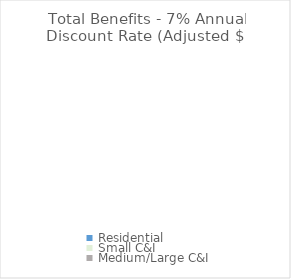
| Category | Total Benefit - 7% Annual Discount Rate (Adjusted $) |
|---|---|
| Residential | 0 |
| Small C&I | 0 |
| Medium/Large C&I | 0 |